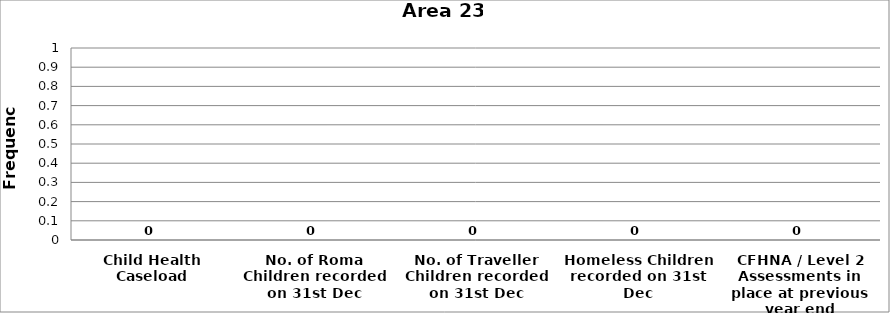
| Category | Area 23 |
|---|---|
| Child Health Caseload | 0 |
| No. of Roma Children recorded on 31st Dec | 0 |
| No. of Traveller Children recorded on 31st Dec | 0 |
| Homeless Children recorded on 31st Dec | 0 |
| CFHNA / Level 2 Assessments in place at previous year end | 0 |